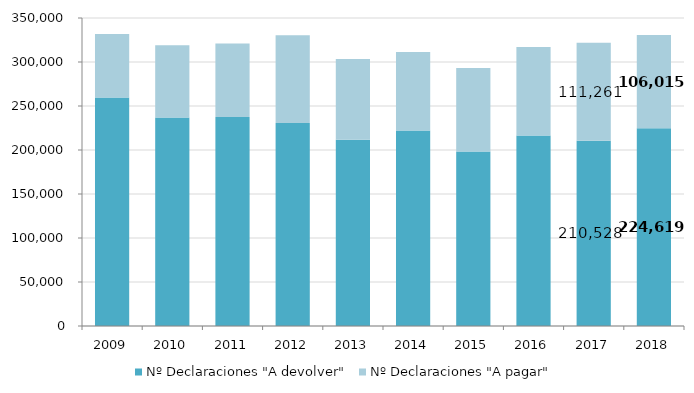
| Category | Nº Declaraciones "A devolver" | Nº Declaraciones "A pagar" |
|---|---|---|
| 2009.0 | 259702 | 72208 |
| 2010.0 | 236808 | 82185 |
| 2011.0 | 237625 | 83528 |
| 2012.0 | 230745 | 99745 |
| 2013.0 | 211586 | 91870 |
| 2014.0 | 222131 | 89308 |
| 2015.0 | 198331 | 94958 |
| 2016.0 | 216509 | 100568 |
| 2017.0 | 210528 | 111261 |
| 2018.0 | 224619.366 | 106015.04 |